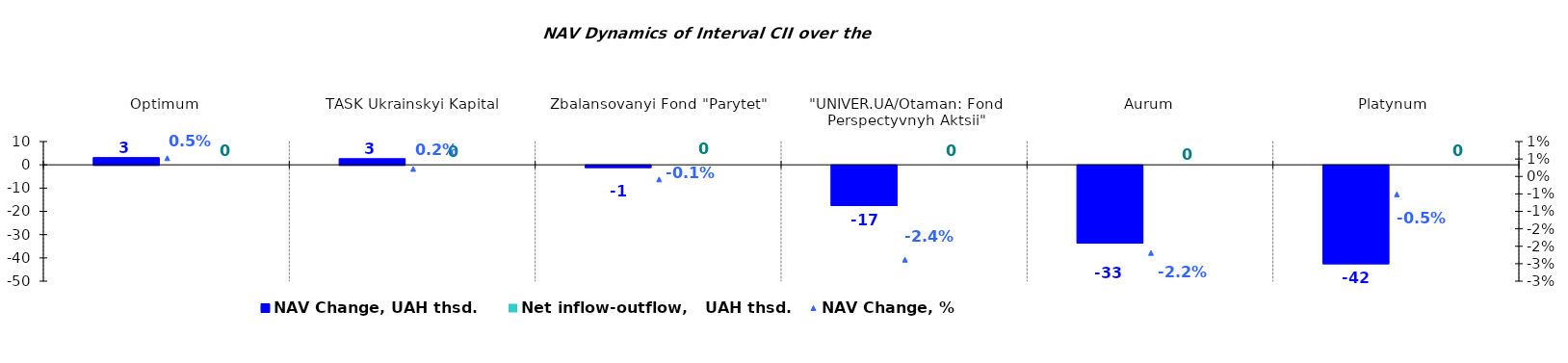
| Category | NAV Change, UAH thsd. | Net inflow-outflow,   UAH thsd. |
|---|---|---|
| Optimum | 3.112 | 0 |
| TASK Ukrainskyi Kapital | 2.642 | 0 |
| Zbalansovanyi Fond "Parytet" | -0.998 | 0 |
| "UNIVER.UA/Otaman: Fond Perspectyvnyh Aktsii" | -17.281 | 0 |
| Аurum | -33.483 | 0 |
| Platynum  | -42.307 | 0 |